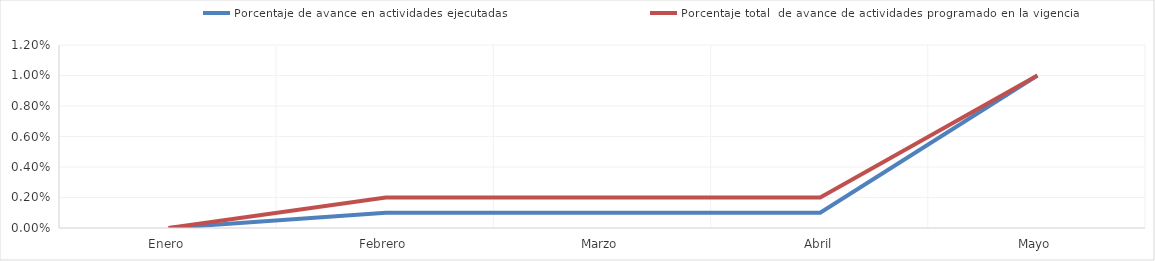
| Category | Porcentaje de avance en actividades ejecutadas | Porcentaje total  de avance de actividades programado en la vigencia |
|---|---|---|
| 0 | 0 | 0 |
| 1 | 0.001 | 0.002 |
| 2 | 0.001 | 0.002 |
| 3 | 0.001 | 0.002 |
| 4 | 0.01 | 0.01 |